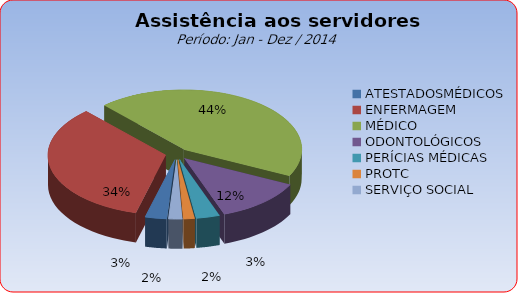
| Category | Series 0 |
|---|---|
| ATESTADOSMÉDICOS | 2.967 |
| ENFERMAGEM | 34.124 |
| MÉDICO | 44.106 |
| ODONTOLÓGICOS | 12.21 |
| PERÍCIAS MÉDICAS | 3.217 |
| PROTC | 1.503 |
| SERVIÇO SOCIAL | 1.872 |